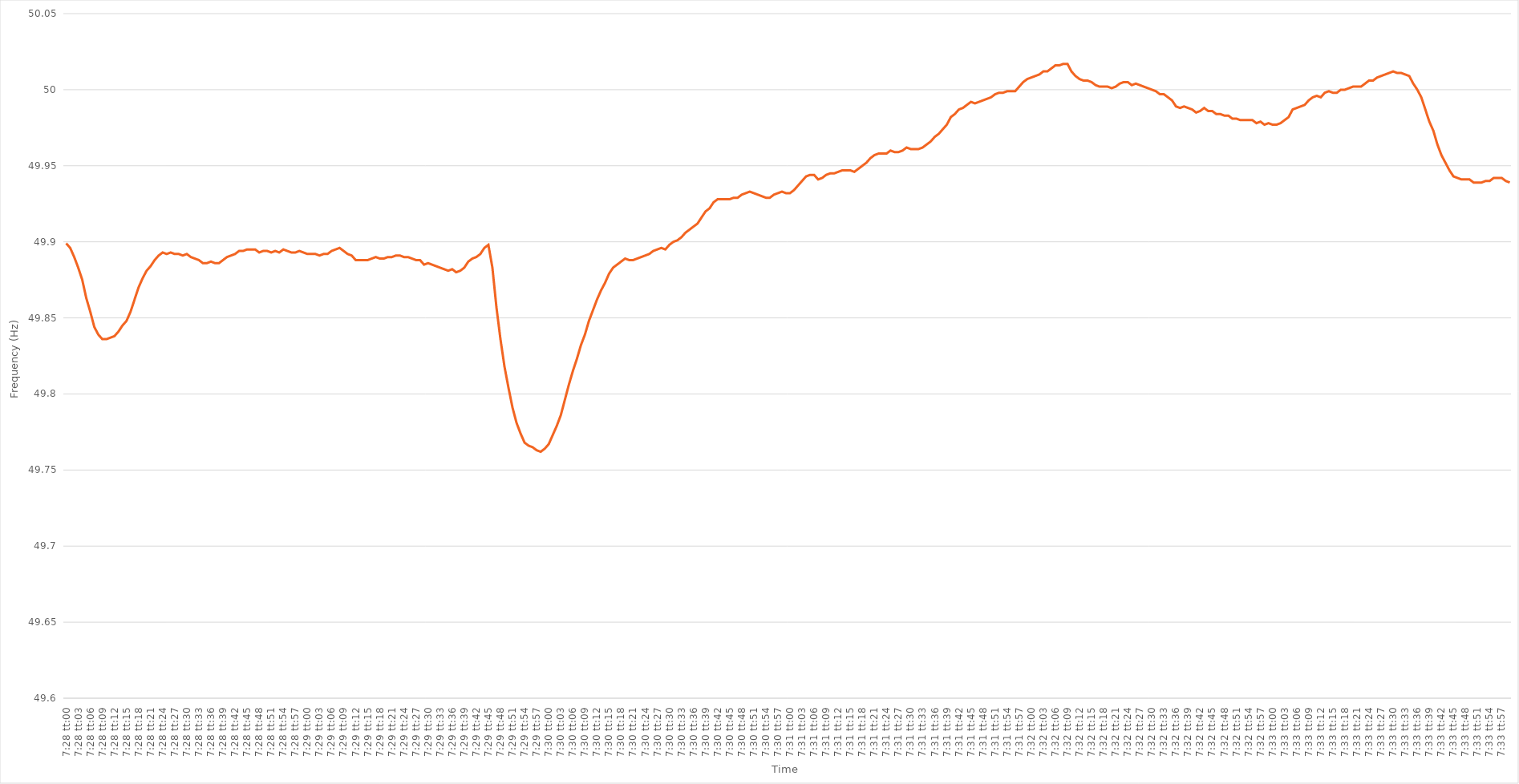
| Category | Series 0 |
|---|---|
| 0.3111111111111111 | 49.899 |
| 0.3111226851851852 | 49.896 |
| 0.31113425925925925 | 49.89 |
| 0.31114583333333334 | 49.883 |
| 0.31115740740740744 | 49.875 |
| 0.3111689814814815 | 49.863 |
| 0.31118055555555557 | 49.854 |
| 0.31119212962962967 | 49.844 |
| 0.3112037037037037 | 49.839 |
| 0.31121527777777774 | 49.836 |
| 0.31122685185185184 | 49.836 |
| 0.31123842592592593 | 49.837 |
| 0.31124999999999997 | 49.838 |
| 0.31126157407407407 | 49.841 |
| 0.31127314814814816 | 49.845 |
| 0.3112847222222222 | 49.848 |
| 0.3112962962962963 | 49.854 |
| 0.3113078703703704 | 49.862 |
| 0.3113194444444444 | 49.87 |
| 0.3113310185185185 | 49.876 |
| 0.3113425925925926 | 49.881 |
| 0.31135416666666665 | 49.884 |
| 0.31136574074074075 | 49.888 |
| 0.31137731481481484 | 49.891 |
| 0.3113888888888889 | 49.893 |
| 0.311400462962963 | 49.892 |
| 0.31141203703703707 | 49.893 |
| 0.3114236111111111 | 49.892 |
| 0.31143518518518515 | 49.892 |
| 0.31144675925925924 | 49.891 |
| 0.31145833333333334 | 49.892 |
| 0.3114699074074074 | 49.89 |
| 0.31148148148148147 | 49.889 |
| 0.31149305555555556 | 49.888 |
| 0.3115046296296296 | 49.886 |
| 0.3115162037037037 | 49.886 |
| 0.3115277777777778 | 49.887 |
| 0.31153935185185183 | 49.886 |
| 0.3115509259259259 | 49.886 |
| 0.3115625 | 49.888 |
| 0.31157407407407406 | 49.89 |
| 0.31158564814814815 | 49.891 |
| 0.31159722222222225 | 49.892 |
| 0.3116087962962963 | 49.894 |
| 0.3116203703703704 | 49.894 |
| 0.3116319444444445 | 49.895 |
| 0.3116435185185185 | 49.895 |
| 0.3116550925925926 | 49.895 |
| 0.3116666666666667 | 49.893 |
| 0.31167824074074074 | 49.894 |
| 0.3116898148148148 | 49.894 |
| 0.3117013888888889 | 49.893 |
| 0.31171296296296297 | 49.894 |
| 0.311724537037037 | 49.893 |
| 0.3117361111111111 | 49.895 |
| 0.3117476851851852 | 49.894 |
| 0.31175925925925924 | 49.893 |
| 0.31177083333333333 | 49.893 |
| 0.3117824074074074 | 49.894 |
| 0.31179398148148146 | 49.893 |
| 0.31180555555555556 | 49.892 |
| 0.31181712962962965 | 49.892 |
| 0.3118287037037037 | 49.892 |
| 0.3118402777777778 | 49.891 |
| 0.3118518518518519 | 49.892 |
| 0.3118634259259259 | 49.892 |
| 0.311875 | 49.894 |
| 0.3118865740740741 | 49.895 |
| 0.31189814814814815 | 49.896 |
| 0.3119097222222222 | 49.894 |
| 0.3119212962962963 | 49.892 |
| 0.3119328703703704 | 49.891 |
| 0.3119444444444444 | 49.888 |
| 0.3119560185185185 | 49.888 |
| 0.3119675925925926 | 49.888 |
| 0.31197916666666664 | 49.888 |
| 0.31199074074074074 | 49.889 |
| 0.31200231481481483 | 49.89 |
| 0.31201388888888887 | 49.889 |
| 0.31202546296296296 | 49.889 |
| 0.31203703703703706 | 49.89 |
| 0.3120486111111111 | 49.89 |
| 0.3120601851851852 | 49.891 |
| 0.3120717592592593 | 49.891 |
| 0.3120833333333333 | 49.89 |
| 0.3120949074074074 | 49.89 |
| 0.3121064814814815 | 49.889 |
| 0.31211805555555555 | 49.888 |
| 0.31212962962962965 | 49.888 |
| 0.31214120370370374 | 49.885 |
| 0.3121527777777778 | 49.886 |
| 0.3121643518518518 | 49.885 |
| 0.3121759259259259 | 49.884 |
| 0.3121875 | 49.883 |
| 0.31219907407407405 | 49.882 |
| 0.31221064814814814 | 49.881 |
| 0.31222222222222223 | 49.882 |
| 0.3122337962962963 | 49.88 |
| 0.31224537037037037 | 49.881 |
| 0.31225694444444446 | 49.883 |
| 0.3122685185185185 | 49.887 |
| 0.3122800925925926 | 49.889 |
| 0.3122916666666667 | 49.89 |
| 0.31230324074074073 | 49.892 |
| 0.3123148148148148 | 49.896 |
| 0.3123263888888889 | 49.898 |
| 0.31233796296296296 | 49.883 |
| 0.31234953703703705 | 49.857 |
| 0.31236111111111114 | 49.836 |
| 0.3123726851851852 | 49.818 |
| 0.3123842592592592 | 49.804 |
| 0.3123958333333333 | 49.791 |
| 0.3124074074074074 | 49.781 |
| 0.31241898148148145 | 49.774 |
| 0.31243055555555554 | 49.768 |
| 0.31244212962962964 | 49.766 |
| 0.3124537037037037 | 49.765 |
| 0.3124652777777778 | 49.763 |
| 0.31247685185185187 | 49.762 |
| 0.3124884259259259 | 49.764 |
| 0.3125 | 49.767 |
| 0.3125115740740741 | 49.773 |
| 0.31252314814814813 | 49.779 |
| 0.3125347222222222 | 49.786 |
| 0.3125462962962963 | 49.796 |
| 0.31255787037037036 | 49.806 |
| 0.31256944444444446 | 49.815 |
| 0.31258101851851855 | 49.823 |
| 0.3125925925925926 | 49.832 |
| 0.3126041666666666 | 49.839 |
| 0.3126157407407408 | 49.848 |
| 0.3126273148148148 | 49.855 |
| 0.31263888888888886 | 49.862 |
| 0.31265046296296295 | 49.868 |
| 0.31266203703703704 | 49.873 |
| 0.3126736111111111 | 49.879 |
| 0.3126851851851852 | 49.883 |
| 0.31269675925925927 | 49.885 |
| 0.3127083333333333 | 49.887 |
| 0.3127199074074074 | 49.889 |
| 0.3127314814814815 | 49.888 |
| 0.31274305555555554 | 49.888 |
| 0.31275462962962963 | 49.889 |
| 0.3127662037037037 | 49.89 |
| 0.31277777777777777 | 49.891 |
| 0.31278935185185186 | 49.892 |
| 0.31280092592592595 | 49.894 |
| 0.3128125 | 49.895 |
| 0.3128240740740741 | 49.896 |
| 0.3128356481481482 | 49.895 |
| 0.3128472222222222 | 49.898 |
| 0.3128587962962963 | 49.9 |
| 0.31287037037037035 | 49.901 |
| 0.31288194444444445 | 49.903 |
| 0.3128935185185185 | 49.906 |
| 0.3129050925925926 | 49.908 |
| 0.3129166666666667 | 49.91 |
| 0.3129282407407407 | 49.912 |
| 0.3129398148148148 | 49.916 |
| 0.3129513888888889 | 49.92 |
| 0.31296296296296294 | 49.922 |
| 0.31297453703703704 | 49.926 |
| 0.31298611111111113 | 49.928 |
| 0.31299768518518517 | 49.928 |
| 0.31300925925925926 | 49.928 |
| 0.31302083333333336 | 49.928 |
| 0.3130324074074074 | 49.929 |
| 0.3130439814814815 | 49.929 |
| 0.3130555555555556 | 49.931 |
| 0.3130671296296296 | 49.932 |
| 0.3130787037037037 | 49.933 |
| 0.31309027777777776 | 49.932 |
| 0.31310185185185185 | 49.931 |
| 0.3131134259259259 | 49.93 |
| 0.313125 | 49.929 |
| 0.3131365740740741 | 49.929 |
| 0.3131481481481481 | 49.931 |
| 0.3131597222222222 | 49.932 |
| 0.3131712962962963 | 49.933 |
| 0.31318287037037035 | 49.932 |
| 0.31319444444444444 | 49.932 |
| 0.31320601851851854 | 49.934 |
| 0.3132175925925926 | 49.937 |
| 0.31322916666666667 | 49.94 |
| 0.31324074074074076 | 49.943 |
| 0.3132523148148148 | 49.944 |
| 0.3132638888888889 | 49.944 |
| 0.313275462962963 | 49.941 |
| 0.31328703703703703 | 49.942 |
| 0.3132986111111111 | 49.944 |
| 0.3133101851851852 | 49.945 |
| 0.31332175925925926 | 49.945 |
| 0.3133333333333333 | 49.946 |
| 0.3133449074074074 | 49.947 |
| 0.3133564814814815 | 49.947 |
| 0.3133680555555555 | 49.947 |
| 0.3133796296296296 | 49.946 |
| 0.3133912037037037 | 49.948 |
| 0.31340277777777775 | 49.95 |
| 0.31341435185185185 | 49.952 |
| 0.31342592592592594 | 49.955 |
| 0.3134375 | 49.957 |
| 0.3134490740740741 | 49.958 |
| 0.31346064814814817 | 49.958 |
| 0.3134722222222222 | 49.958 |
| 0.3134837962962963 | 49.96 |
| 0.3134953703703704 | 49.959 |
| 0.31350694444444444 | 49.959 |
| 0.31351851851851853 | 49.96 |
| 0.3135300925925926 | 49.962 |
| 0.31354166666666666 | 49.961 |
| 0.3135532407407407 | 49.961 |
| 0.31356481481481485 | 49.961 |
| 0.3135763888888889 | 49.962 |
| 0.31358796296296293 | 49.964 |
| 0.313599537037037 | 49.966 |
| 0.3136111111111111 | 49.969 |
| 0.31362268518518516 | 49.971 |
| 0.31363425925925925 | 49.974 |
| 0.31364583333333335 | 49.977 |
| 0.3136574074074074 | 49.982 |
| 0.3136689814814815 | 49.984 |
| 0.3136805555555556 | 49.987 |
| 0.3136921296296296 | 49.988 |
| 0.3137037037037037 | 49.99 |
| 0.3137152777777778 | 49.992 |
| 0.31372685185185184 | 49.991 |
| 0.31373842592592593 | 49.992 |
| 0.31375000000000003 | 49.993 |
| 0.31376157407407407 | 49.994 |
| 0.31377314814814816 | 49.995 |
| 0.31378472222222226 | 49.997 |
| 0.3137962962962963 | 49.998 |
| 0.3138078703703704 | 49.998 |
| 0.31381944444444443 | 49.999 |
| 0.3138310185185185 | 49.999 |
| 0.31384259259259256 | 49.999 |
| 0.31385416666666666 | 50.002 |
| 0.31386574074074075 | 50.005 |
| 0.3138773148148148 | 50.007 |
| 0.3138888888888889 | 50.008 |
| 0.313900462962963 | 50.009 |
| 0.313912037037037 | 50.01 |
| 0.3139236111111111 | 50.012 |
| 0.3139351851851852 | 50.012 |
| 0.31394675925925924 | 50.014 |
| 0.31395833333333334 | 50.016 |
| 0.31396990740740743 | 50.016 |
| 0.3139814814814815 | 50.017 |
| 0.31399305555555557 | 50.017 |
| 0.31400462962962966 | 50.012 |
| 0.3140162037037037 | 50.009 |
| 0.3140277777777778 | 50.007 |
| 0.31403935185185183 | 50.006 |
| 0.31405092592592593 | 50.006 |
| 0.31406249999999997 | 50.005 |
| 0.31407407407407406 | 50.003 |
| 0.31408564814814816 | 50.002 |
| 0.3140972222222222 | 50.002 |
| 0.3141087962962963 | 50.002 |
| 0.3141203703703704 | 50.001 |
| 0.3141319444444444 | 50.002 |
| 0.3141435185185185 | 50.004 |
| 0.3141550925925926 | 50.005 |
| 0.31416666666666665 | 50.005 |
| 0.31417824074074074 | 50.003 |
| 0.31418981481481484 | 50.004 |
| 0.3142013888888889 | 50.003 |
| 0.31421296296296297 | 50.002 |
| 0.31422453703703707 | 50.001 |
| 0.3142361111111111 | 50 |
| 0.3142476851851852 | 49.999 |
| 0.31425925925925924 | 49.997 |
| 0.31427083333333333 | 49.997 |
| 0.31428240740740737 | 49.995 |
| 0.3142939814814815 | 49.993 |
| 0.31430555555555556 | 49.989 |
| 0.3143171296296296 | 49.988 |
| 0.3143287037037037 | 49.989 |
| 0.3143402777777778 | 49.988 |
| 0.3143518518518518 | 49.987 |
| 0.3143634259259259 | 49.985 |
| 0.314375 | 49.986 |
| 0.31438657407407405 | 49.988 |
| 0.31439814814814815 | 49.986 |
| 0.31440972222222224 | 49.986 |
| 0.3144212962962963 | 49.984 |
| 0.3144328703703704 | 49.984 |
| 0.31444444444444447 | 49.983 |
| 0.3144560185185185 | 49.983 |
| 0.3144675925925926 | 49.981 |
| 0.3144791666666667 | 49.981 |
| 0.31449074074074074 | 49.98 |
| 0.3145023148148148 | 49.98 |
| 0.3145138888888889 | 49.98 |
| 0.31452546296296297 | 49.98 |
| 0.314537037037037 | 49.978 |
| 0.3145486111111111 | 49.979 |
| 0.3145601851851852 | 49.977 |
| 0.31457175925925923 | 49.978 |
| 0.3145833333333333 | 49.977 |
| 0.3145949074074074 | 49.977 |
| 0.31460648148148146 | 49.978 |
| 0.31461805555555555 | 49.98 |
| 0.31462962962962965 | 49.982 |
| 0.3146412037037037 | 49.987 |
| 0.3146527777777778 | 49.988 |
| 0.3146643518518519 | 49.989 |
| 0.3146759259259259 | 49.99 |
| 0.3146875 | 49.993 |
| 0.3146990740740741 | 49.995 |
| 0.31471064814814814 | 49.996 |
| 0.31472222222222224 | 49.995 |
| 0.31473379629629633 | 49.998 |
| 0.31474537037037037 | 49.999 |
| 0.31475694444444446 | 49.998 |
| 0.3147685185185185 | 49.998 |
| 0.3147800925925926 | 50 |
| 0.31479166666666664 | 50 |
| 0.31480324074074073 | 50.001 |
| 0.3148148148148148 | 50.002 |
| 0.31482638888888886 | 50.002 |
| 0.31483796296296296 | 50.002 |
| 0.31484953703703705 | 50.004 |
| 0.3148611111111111 | 50.006 |
| 0.3148726851851852 | 50.006 |
| 0.3148842592592593 | 50.008 |
| 0.3148958333333333 | 50.009 |
| 0.3149074074074074 | 50.01 |
| 0.3149189814814815 | 50.011 |
| 0.31493055555555555 | 50.012 |
| 0.31494212962962964 | 50.011 |
| 0.31495370370370374 | 50.011 |
| 0.3149652777777778 | 50.01 |
| 0.31497685185185187 | 50.009 |
| 0.3149884259259259 | 50.004 |
| 0.315 | 50 |
| 0.31501157407407404 | 49.995 |
| 0.31502314814814814 | 49.987 |
| 0.31503472222222223 | 49.979 |
| 0.31504629629629627 | 49.973 |
| 0.31505787037037036 | 49.964 |
| 0.31506944444444446 | 49.957 |
| 0.3150810185185185 | 49.952 |
| 0.3150925925925926 | 49.947 |
| 0.3151041666666667 | 49.943 |
| 0.3151157407407407 | 49.942 |
| 0.3151273148148148 | 49.941 |
| 0.3151388888888889 | 49.941 |
| 0.31515046296296295 | 49.941 |
| 0.31516203703703705 | 49.939 |
| 0.31517361111111114 | 49.939 |
| 0.3151851851851852 | 49.939 |
| 0.3151967592592593 | 49.94 |
| 0.3152083333333333 | 49.94 |
| 0.3152199074074074 | 49.942 |
| 0.31523148148148145 | 49.942 |
| 0.3152430555555556 | 49.942 |
| 0.31525462962962963 | 49.94 |
| 0.3152662037037037 | 49.939 |